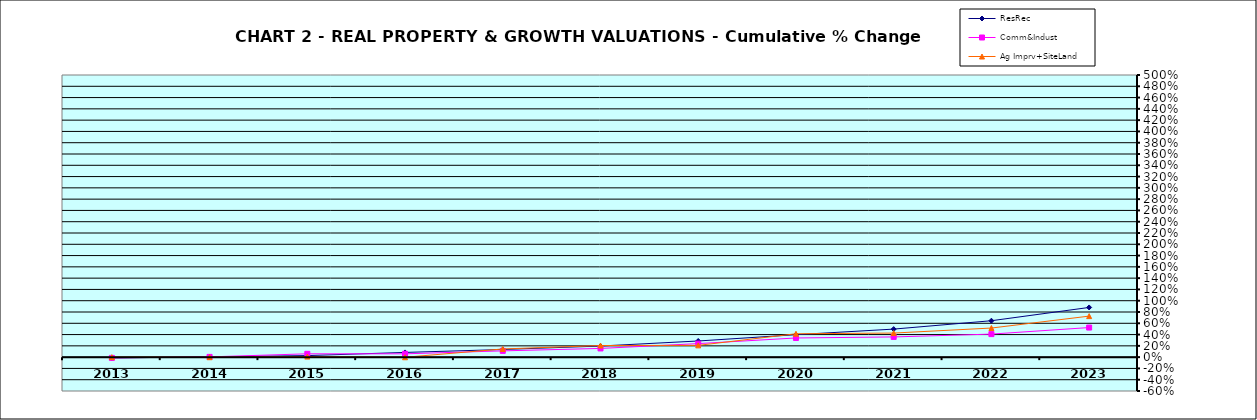
| Category | ResRec | Comm&Indust | Ag Imprv+SiteLand |
|---|---|---|---|
| 2013.0 | -0.013 | -0.013 | 0 |
| 2014.0 | 0.004 | 0.005 | -0.001 |
| 2015.0 | 0.028 | 0.059 | 0.01 |
| 2016.0 | 0.084 | 0.059 | -0.002 |
| 2017.0 | 0.135 | 0.111 | 0.145 |
| 2018.0 | 0.197 | 0.154 | 0.206 |
| 2019.0 | 0.286 | 0.24 | 0.209 |
| 2020.0 | 0.398 | 0.34 | 0.415 |
| 2021.0 | 0.497 | 0.358 | 0.427 |
| 2022.0 | 0.645 | 0.408 | 0.516 |
| 2023.0 | 0.881 | 0.524 | 0.727 |